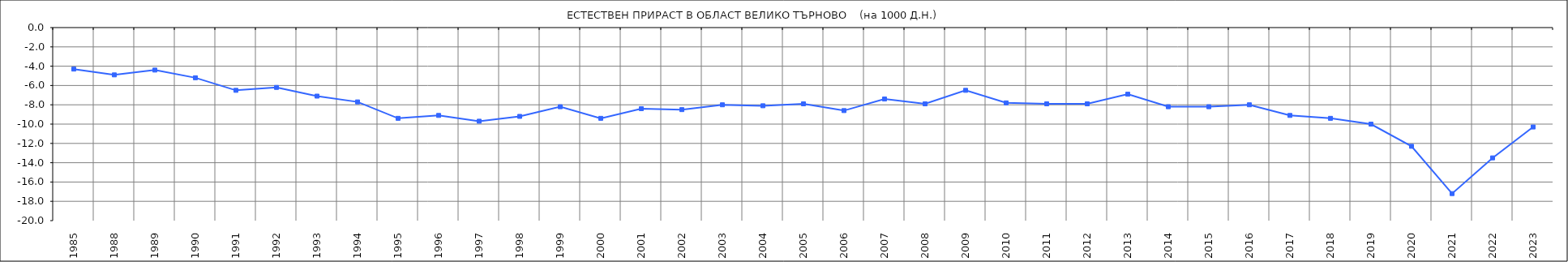
| Category | Series 0 | Series 1 |
|---|---|---|
| 1985.0 | -4.3 |  |
| 1988.0 | -4.9 |  |
| 1989.0 | -4.4 |  |
| 1990.0 | -5.2 |  |
| 1991.0 | -6.5 |  |
| 1992.0 | -6.2 |  |
| 1993.0 | -7.1 |  |
| 1994.0 | -7.7 |  |
| 1995.0 | -9.4 |  |
| 1996.0 | -9.1 |  |
| 1997.0 | -9.7 |  |
| 1998.0 | -9.2 |  |
| 1999.0 | -8.2 |  |
| 2000.0 | -9.4 |  |
| 2001.0 | -8.4 |  |
| 2002.0 | -8.5 |  |
| 2003.0 | -8 |  |
| 2004.0 | -8.1 |  |
| 2005.0 | -7.9 |  |
| 2006.0 | -8.6 |  |
| 2007.0 | -7.4 |  |
| 2008.0 | -7.9 |  |
| 2009.0 | -6.5 |  |
| 2010.0 | -7.8 |  |
| 2011.0 | -7.9 |  |
| 2012.0 | -7.9 |  |
| 2013.0 | -6.9 |  |
| 2014.0 | -8.2 |  |
| 2015.0 | -8.2 |  |
| 2016.0 | -8 |  |
| 2017.0 | -9.1 |  |
| 2018.0 | -9.4 |  |
| 2019.0 | -10 |  |
| 2020.0 | -12.3 |  |
| 2021.0 | -17.2 |  |
| 2022.0 | -13.5 |  |
| 2023.0 | -10.3 |  |